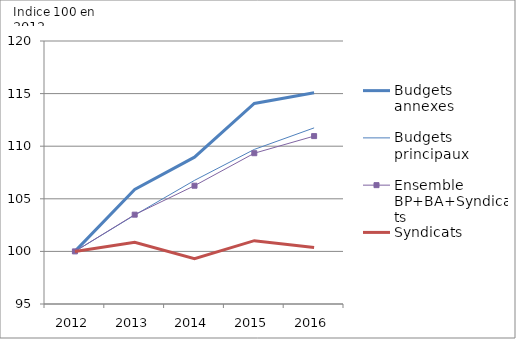
| Category | Budgets annexes | Budgets principaux | Ensemble BP+BA+Syndicats | Syndicats  |
|---|---|---|---|---|
| 2012.0 | 100 | 100 | 100 | 100 |
| 2013.0 | 105.89 | 103.455 | 103.493 | 100.863 |
| 2014.0 | 108.956 | 106.753 | 106.244 | 99.31 |
| 2015.0 | 114.067 | 109.694 | 109.334 | 101.021 |
| 2016.0 | 115.072 | 111.742 | 110.961 | 100.372 |